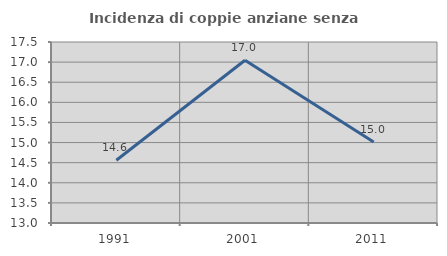
| Category | Incidenza di coppie anziane senza figli  |
|---|---|
| 1991.0 | 14.56 |
| 2001.0 | 17.045 |
| 2011.0 | 15.016 |